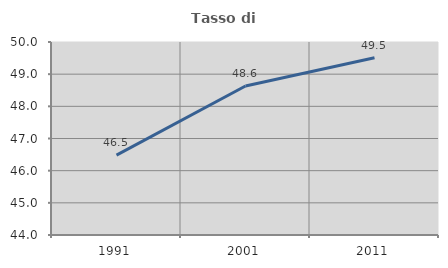
| Category | Tasso di occupazione   |
|---|---|
| 1991.0 | 46.483 |
| 2001.0 | 48.631 |
| 2011.0 | 49.511 |